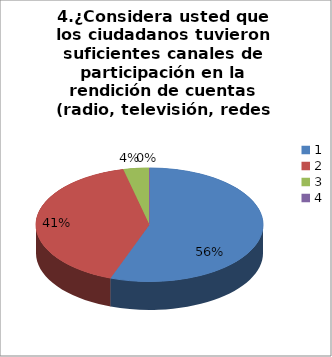
| Category | Series 0 |
|---|---|
| 0 | 30 |
| 1 | 22 |
| 2 | 2 |
| 3 | 0 |